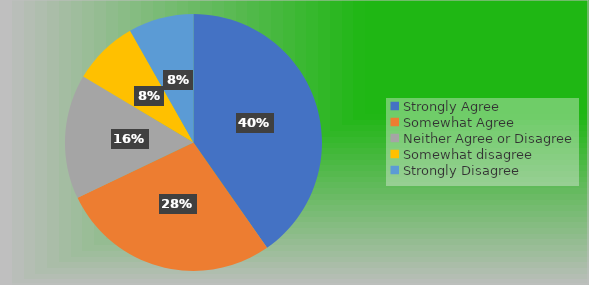
| Category | Series 0 |
|---|---|
| Strongly Agree | 54 |
| Somewhat Agree | 37 |
| Neither Agree or Disagree | 21 |
| Somewhat disagree | 11 |
| Strongly Disagree | 11 |